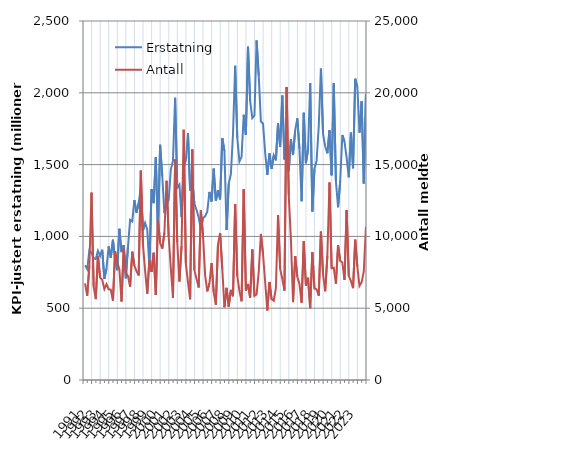
| Category | Erstatning |
|---|---|
| 1991.0 | 798.771 |
| nan | 772.723 |
| nan | 901.614 |
| nan | 886.29 |
| 1992.0 | 848.024 |
| nan | 842.608 |
| nan | 899.675 |
| nan | 863.599 |
| 1993.0 | 906.815 |
| nan | 704.252 |
| nan | 777.007 |
| nan | 929.903 |
| 1994.0 | 851.449 |
| nan | 976.75 |
| nan | 837.148 |
| nan | 764.334 |
| 1995.0 | 1053.453 |
| nan | 890.411 |
| nan | 939.514 |
| nan | 708.525 |
| 1996.0 | 923.128 |
| nan | 1115.219 |
| nan | 1104.097 |
| nan | 1252.794 |
| 1997.0 | 1165.24 |
| nan | 1232.246 |
| nan | 1335.922 |
| nan | 1038.595 |
| 1998.0 | 1094.144 |
| nan | 1048.498 |
| nan | 785.812 |
| nan | 1329.052 |
| 1999.0 | 1231.421 |
| nan | 1550.675 |
| nan | 1010.239 |
| nan | 1637.818 |
| 2000.0 | 1420.337 |
| nan | 1162.38 |
| nan | 1215.239 |
| nan | 1254.16 |
| 2001.0 | 1465.995 |
| nan | 1525.996 |
| nan | 1964.89 |
| nan | 1339.092 |
| 2002.0 | 1360.09 |
| nan | 1135.146 |
| nan | 1481.191 |
| nan | 1532.052 |
| 2003.0 | 1719.044 |
| nan | 1319.561 |
| nan | 1392.937 |
| nan | 1226.732 |
| 2004.0 | 1183.121 |
| nan | 1131.791 |
| nan | 1046.64 |
| nan | 1127.583 |
| 2005.0 | 1139.802 |
| nan | 1172.62 |
| nan | 1309.973 |
| nan | 1243.106 |
| 2006.0 | 1471.992 |
| nan | 1246.741 |
| nan | 1322.17 |
| nan | 1257.753 |
| 2007.0 | 1684.327 |
| nan | 1595.586 |
| nan | 1045.371 |
| nan | 1367.563 |
| 2008.0 | 1432.37 |
| nan | 1713.692 |
| nan | 2188.109 |
| nan | 1685.597 |
| 2009.0 | 1521.949 |
| nan | 1553.837 |
| nan | 1846.841 |
| nan | 1706.387 |
| 2010.0 | 2320.986 |
| nan | 1942.33 |
| nan | 1823.643 |
| nan | 1841.234 |
| 2011.0 | 2364.111 |
| nan | 2121.028 |
| nan | 1799.974 |
| nan | 1786.833 |
| 2012.0 | 1582.679 |
| nan | 1427.871 |
| nan | 1577.933 |
| nan | 1470.221 |
| 2013.0 | 1564.307 |
| nan | 1529.632 |
| nan | 1786.887 |
| nan | 1624.069 |
| 2014.0 | 1981.363 |
| nan | 1535.996 |
| nan | 1666.36 |
| nan | 1454.41 |
| 2015.0 | 1675.639 |
| nan | 1566.357 |
| nan | 1739.517 |
| nan | 1822.679 |
| 2016.0 | 1609.072 |
| nan | 1245.078 |
| nan | 1861.218 |
| nan | 1509.538 |
| 2017.0 | 1604.633 |
| nan | 2067.493 |
| nan | 1173.567 |
| nan | 1471.348 |
| 2018.0 | 1527.565 |
| nan | 1768.718 |
| nan | 2168.295 |
| nan | 1713.017 |
| 2019.0 | 1627.997 |
| nan | 1578.473 |
| nan | 1739.371 |
| nan | 1425.166 |
| 2020.0 | 2066.244 |
| nan | 1384.009 |
| nan | 1203.29 |
| nan | 1383.92 |
| 2021.0 | 1705.987 |
| nan | 1659.922 |
| nan | 1546.156 |
| nan | 1411.985 |
| 2022.0 | 1722.681 |
| nan | 1474.218 |
| nan | 2097.646 |
| nan | 2039.182 |
| 2023.0 | 1723.032 |
| nan | 1941.342 |
| nan | 1368.955 |
| nan | 1990.084 |